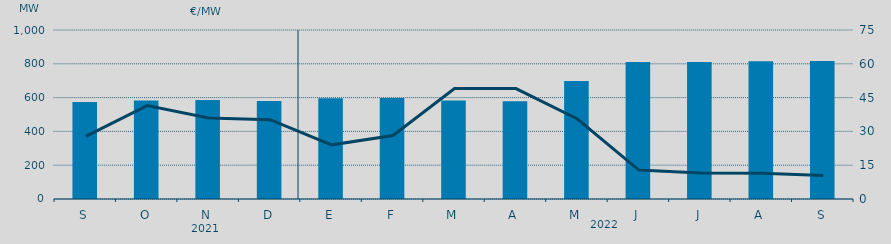
| Category | Potencia media a subir |
|---|---|
| S | 574.157 |
| O | 583.016 |
| N | 586.378 |
| D | 579.847 |
| E | 595.423 |
| F | 598.173 |
| M | 582.265 |
| A | 578.1 |
| M | 698 |
| J | 810.166 |
| J | 810.419 |
| A | 815.058 |
| S | 816.21 |